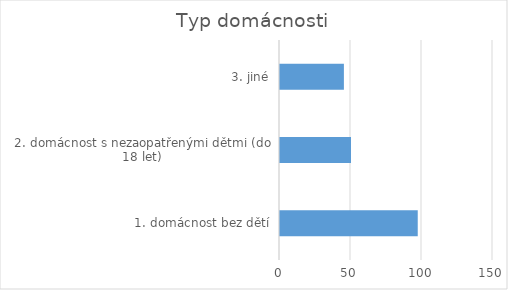
| Category | Series 0 |
|---|---|
| 1. domácnost bez dětí | 97 |
| 2. domácnost s nezaopatřenými dětmi (do 18 let) | 50 |
| 3. jiné | 45 |